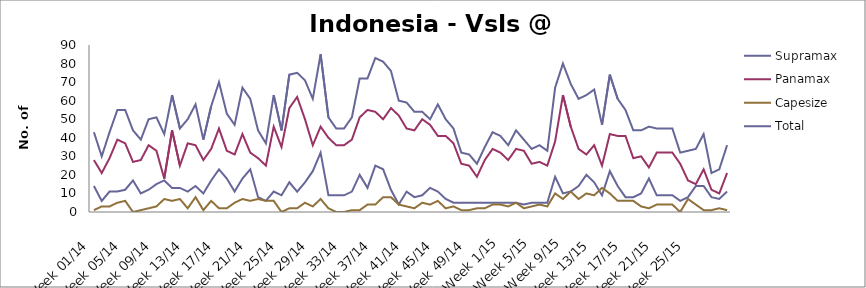
| Category | Supramax | Panamax | Capesize | Total |
|---|---|---|---|---|
| Week 01/14 | 14 | 28 | 1 | 43 |
| Week 02/14 | 6 | 21 | 3 | 30 |
| Week 03/14 | 11 | 29 | 3 | 43 |
| Week 04/14 | 11 | 39 | 5 | 55 |
| Week 05/14 | 12 | 37 | 6 | 55 |
| Week 06/14 | 17 | 27 | 0 | 44 |
| Week 07/14 | 10 | 28 | 1 | 39 |
| Week 08/14 | 12 | 36 | 2 | 50 |
| Week 09/14 | 15 | 33 | 3 | 51 |
| Week 10/14 | 17 | 18 | 7 | 42 |
| Week 11/14 | 13 | 44 | 6 | 63 |
| Week 12/14 | 13 | 25 | 7 | 45 |
| Week 13/14 | 11 | 37 | 2 | 50 |
| Week 14/14 | 14 | 36 | 8 | 58 |
| Week 15/14 | 10 | 28 | 1 | 39 |
| Week 16/14 | 17 | 34 | 6 | 57 |
| Week 17/14 | 23 | 45 | 2 | 70 |
| Week 18/14 | 18 | 33 | 2 | 53 |
| Week 19/14 | 11 | 31 | 5 | 47 |
| Week 20/14 | 18 | 42 | 7 | 67 |
| Week 21/14 | 23 | 32 | 6 | 61 |
| Week 22/14 | 8 | 29 | 7 | 44 |
| Week 23/14 | 6 | 25 | 6 | 37 |
| Week 24/14 | 11 | 46 | 6 | 63 |
| Week 25/14 | 9 | 35 | 0 | 44 |
| Week 26/14 | 16 | 56 | 2 | 74 |
| Week 27/14 | 11 | 62 | 2 | 75 |
| Week 28/14 | 16 | 50 | 5 | 71 |
| Week 29/14 | 22 | 36 | 3 | 61 |
| Week 30/14 | 32 | 46 | 7 | 85 |
| Week 31/14 | 9 | 40 | 2 | 51 |
| Week 32/14 | 9 | 36 | 0 | 45 |
| Week 33/14 | 9 | 36 | 0 | 45 |
| Week 34/14 | 11 | 39 | 1 | 51 |
| Week 35/14 | 20 | 51 | 1 | 72 |
| Week 36/14 | 13 | 55 | 4 | 72 |
| Week 37/14 | 25 | 54 | 4 | 83 |
| Week 38/14 | 23 | 50 | 8 | 81 |
| Week 39/14 | 12 | 56 | 8 | 76 |
| Week 40/14 | 4 | 52 | 4 | 60 |
| Week 41/14 | 11 | 45 | 3 | 59 |
| Week 42/14 | 8 | 44 | 2 | 54 |
| Week 43/14 | 9 | 50 | 5 | 54 |
| Week 44/14 | 13 | 47 | 4 | 50 |
| Week 45/14 | 11 | 41 | 6 | 58 |
| Week 46/14 | 7 | 41 | 2 | 50 |
| Week 47/14 | 5 | 37 | 3 | 45 |
| Week 48/14 | 5 | 26 | 1 | 32 |
| Week 49/14 | 5 | 25 | 1 | 31 |
| Week 50/14 | 5 | 19 | 2 | 26 |
| Week 51/14 | 5 | 28 | 2 | 35 |
| Week 52/14 | 5 | 34 | 4 | 43 |
| Week 1/15 | 5 | 32 | 4 | 41 |
| Week 2/15 | 5 | 28 | 3 | 36 |
| Week 3/15 | 5 | 34 | 5 | 44 |
| Week 4/15 | 4 | 33 | 2 | 39 |
| Week 5/15 | 5 | 26 | 3 | 34 |
| Week 6/15 | 5 | 27 | 4 | 36 |
| Week 7/15 | 5 | 25 | 3 | 33 |
| Week 8/15 | 19 | 38 | 10 | 67 |
| Week 9/15 | 10 | 63 | 7 | 80 |
| Week 10/15 | 11 | 46 | 11 | 69 |
| Week 11/15 | 14 | 34 | 7 | 61 |
| Week 12/15 | 20 | 31 | 10 | 63 |
| Week 13/15 | 16 | 36 | 9 | 66 |
| Week 14/15 | 9 | 25 | 13 | 47 |
| Week 15/15 | 22 | 42 | 10 | 74 |
| Week 16/15 | 14 | 41 | 6 | 61 |
| Week 17/15 | 8 | 41 | 6 | 55 |
| Week 18/15 | 8 | 29 | 6 | 44 |
| Week 19/15 | 10 | 30 | 3 | 44 |
| Week 20/15 | 18 | 24 | 2 | 46 |
| Week 21/15 | 9 | 32 | 4 | 45 |
| Week 22/15 | 9 | 32 | 4 | 45 |
| Week 23/15 | 9 | 32 | 4 | 45 |
| Week 24/15 | 6 | 26 | 0 | 32 |
| Week 25/15 | 8 | 17 | 7 | 33 |